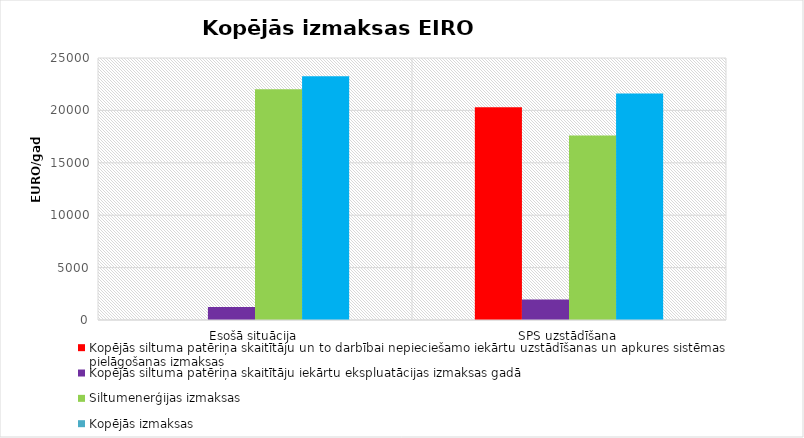
| Category | Kopējās siltuma patēriņa skaitītāju un to darbībai nepieciešamo iekārtu uzstādīšanas un apkures sistēmas pielāgošanas izmaksas  | Kopējās siltuma patēriņa skaitītāju iekārtu ekspluatācijas izmaksas gadā | Siltumenerģijas izmaksas | Kopējās izmaksas |
|---|---|---|---|---|
| Esošā situācija | 0 | 1250 | 22020 | 23270 |
| SPS uzstādīšana | 20300 | 1960 | 17616 | 21606 |